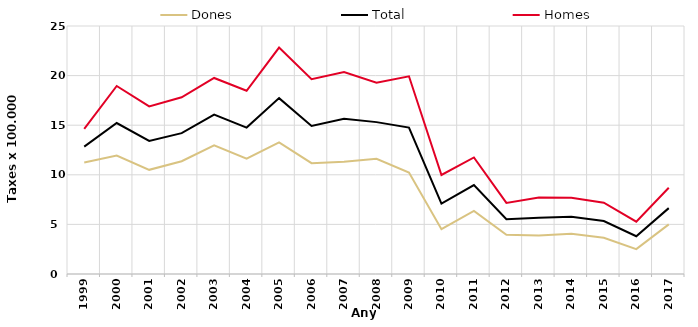
| Category | Dones | Total | Homes |
|---|---|---|---|
| 1999.0 | 11.24 | 12.84 | 14.64 |
| 2000.0 | 11.94 | 15.22 | 18.95 |
| 2001.0 | 10.5 | 13.42 | 16.9 |
| 2002.0 | 11.37 | 14.2 | 17.81 |
| 2003.0 | 12.98 | 16.06 | 19.76 |
| 2004.0 | 11.62 | 14.76 | 18.47 |
| 2005.0 | 13.26 | 17.73 | 22.83 |
| 2006.0 | 11.17 | 14.92 | 19.64 |
| 2007.0 | 11.31 | 15.64 | 20.35 |
| 2008.0 | 11.61 | 15.31 | 19.29 |
| 2009.0 | 10.22 | 14.76 | 19.93 |
| 2010.0 | 4.52 | 7.1 | 9.98 |
| 2011.0 | 6.36 | 8.97 | 11.75 |
| 2012.0 | 3.96 | 5.53 | 7.17 |
| 2013.0 | 3.89 | 5.66 | 7.7 |
| 2014.0 | 4.06 | 5.77 | 7.68 |
| 2015.0 | 3.66 | 5.34 | 7.19 |
| 2016.0 | 2.51 | 3.81 | 5.27 |
| 2017.0 | 5 | 6.64 | 8.7 |